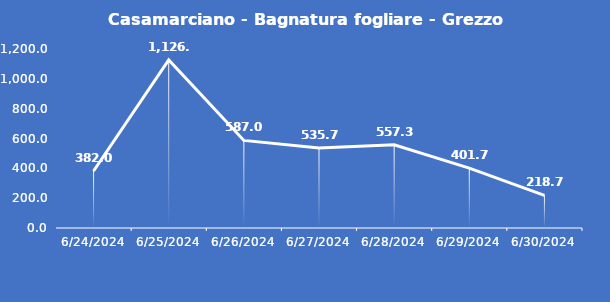
| Category | Casamarciano - Bagnatura fogliare - Grezzo (min) |
|---|---|
| 6/24/24 | 382 |
| 6/25/24 | 1126.3 |
| 6/26/24 | 587 |
| 6/27/24 | 535.7 |
| 6/28/24 | 557.3 |
| 6/29/24 | 401.7 |
| 6/30/24 | 218.7 |